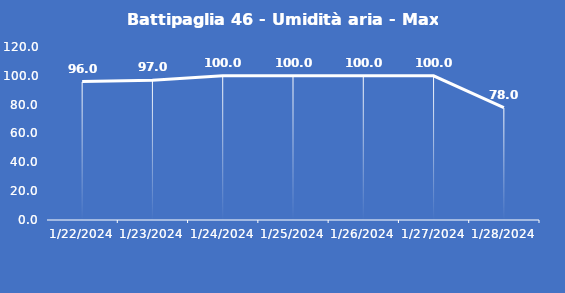
| Category | Battipaglia 46 - Umidità aria - Max (%) |
|---|---|
| 1/22/24 | 96 |
| 1/23/24 | 97 |
| 1/24/24 | 100 |
| 1/25/24 | 100 |
| 1/26/24 | 100 |
| 1/27/24 | 100 |
| 1/28/24 | 78 |